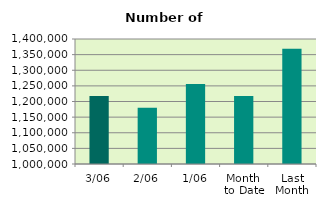
| Category | Series 0 |
|---|---|
| 3/06 | 1217594 |
| 2/06 | 1180064 |
| 1/06 | 1255794 |
| Month 
to Date | 1217817.333 |
| Last
Month | 1368600.286 |